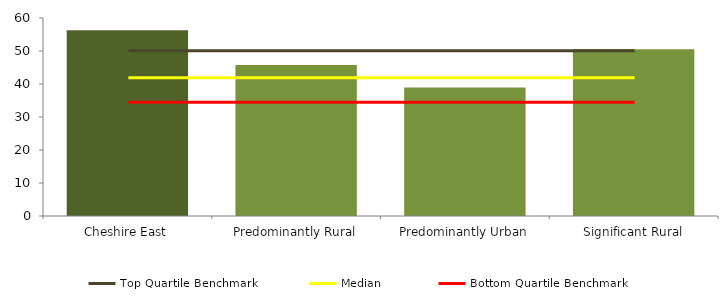
| Category | Series 0 |
|---|---|
| Cheshire East | 56.3 |
| Predominantly Rural | 45.755 |
| Predominantly Urban | 38.911 |
| Significant Rural | 50.53 |